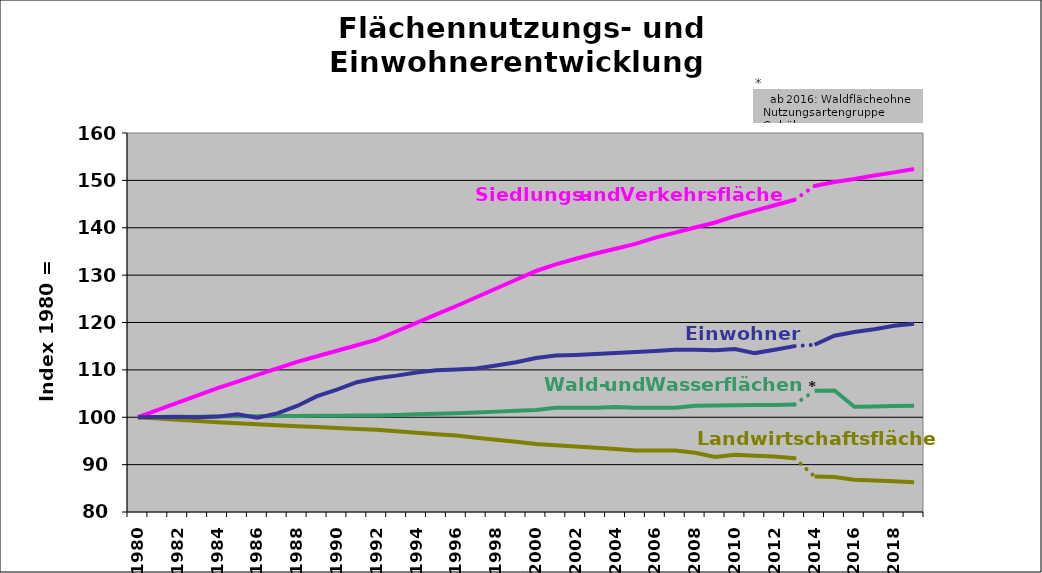
| Category | Siedlungs- und Verkehrsfläche | Wald- und Wasserfläche | Landwirtschaftsfläche | Einwohner |
|---|---|---|---|---|
| 1980.0 | 100 | 100 | 100 | 100 |
| 1981.0 | 101.538 | 100.038 | 99.742 | 100.069 |
| 1982.0 | 103.076 | 100.076 | 99.484 | 100.094 |
| 1983.0 | 104.614 | 100.114 | 99.226 | 99.985 |
| 1984.0 | 106.152 | 100.152 | 98.968 | 100.132 |
| 1985.0 | 107.54 | 100.185 | 98.753 | 100.614 |
| 1986.0 | 108.929 | 100.219 | 98.538 | 99.913 |
| 1987.0 | 110.317 | 100.253 | 98.323 | 100.822 |
| 1988.0 | 111.705 | 100.286 | 98.108 | 102.386 |
| 1989.0 | 112.871 | 100.311 | 97.918 | 104.468 |
| 1990.0 | 114.036 | 100.335 | 97.728 | 105.81 |
| 1991.0 | 115.202 | 100.36 | 97.538 | 107.401 |
| 1992.0 | 116.367 | 100.385 | 97.348 | 108.25 |
| 1993.0 | 118.146 | 100.498 | 97.043 | 108.785 |
| 1994.0 | 119.925 | 100.611 | 96.738 | 109.438 |
| 1995.0 | 121.705 | 100.724 | 96.433 | 109.897 |
| 1996.0 | 123.484 | 100.837 | 96.127 | 110.103 |
| 1997.0 | 125.331 | 101.012 | 95.689 | 110.287 |
| 1998.0 | 127.178 | 101.188 | 95.251 | 110.911 |
| 1999.0 | 129.025 | 101.363 | 94.812 | 111.596 |
| 2000.0 | 130.872 | 101.538 | 94.374 | 112.506 |
| 2001.0 | 132.275 | 102 | 94.111 | 113.031 |
| 2002.0 | 133.45 | 102 | 93.849 | 113.156 |
| 2003.0 | 134.555 | 102 | 93.586 | 113.36 |
| 2004.0 | 135.553 | 102.158 | 93.323 | 113.547 |
| 2005.0 | 136.583 | 102 | 93 | 113.777 |
| 2006.0 | 137.923 | 102 | 93 | 113.992 |
| 2007.0 | 138.971 | 102 | 93 | 114.245 |
| 2008.0 | 140.041 | 102.449 | 92.502 | 114.239 |
| 2009.0 | 141.108 | 102.479 | 91.632 | 114.154 |
| 2010.0 | 142.459 | 102.529 | 92.089 | 114.412 |
| 2011.0 | 143.629 | 102.56 | 91.891 | 113.543 |
| 2012.0 | 144.739 | 102.589 | 91.704 | 114.238 |
| 2013.0 | 145.918 | 102.711 | 91.349 | 115.011 |
| 2014.0 | 148.819 | 105.577 | 87.483 | 115.3 |
| 2015.0 | 149.67 | 105.635 | 87.371 | 117.194 |
| 2016.0 | 150.278 | 102.212 | 86.81 | 117.99 |
| 2017.0 | 151.038 | 102.28 | 86.664 | 118.596 |
| 2018.0 | 151.687 | 102.352 | 86.499 | 119.322 |
| 2019.0 | 152.391 | 102.439 | 86.292 | 119.76 |